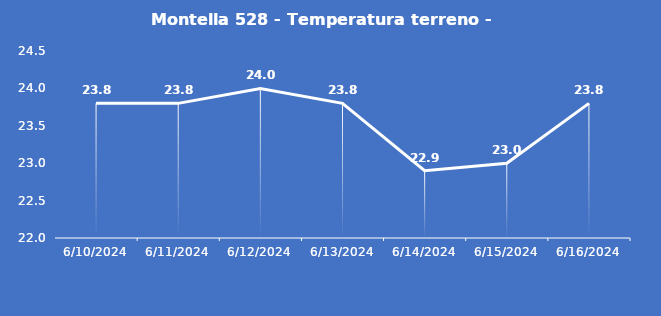
| Category | Montella 528 - Temperatura terreno - Grezzo (°C) |
|---|---|
| 6/10/24 | 23.8 |
| 6/11/24 | 23.8 |
| 6/12/24 | 24 |
| 6/13/24 | 23.8 |
| 6/14/24 | 22.9 |
| 6/15/24 | 23 |
| 6/16/24 | 23.8 |